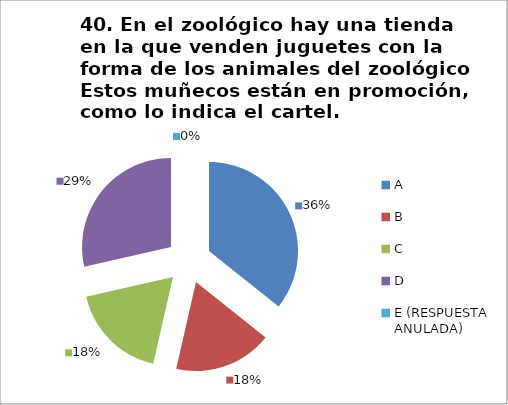
| Category | CANTIDAD DE RESPUESTAS PREGUNTA (40) | PORCENTAJE |
|---|---|---|
| A | 10 | 0.357 |
| B | 5 | 0.179 |
| C | 5 | 0.179 |
| D | 8 | 0.286 |
| E (RESPUESTA ANULADA) | 0 | 0 |